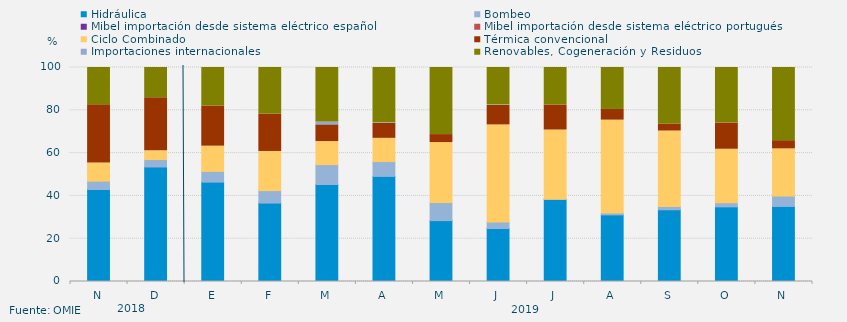
| Category | Hidráulica | Bombeo | Mibel importación desde sistema eléctrico español | Mibel importación desde sistema eléctrico portugués | Ciclo Combinado | Térmica convencional | Importaciones internacionales | Renovables, Cogeneración y Residuos |
|---|---|---|---|---|---|---|---|---|
| N | 42.998 | 3.9 | 0 | 0 | 8.472 | 27.187 | 0 | 17.442 |
| D | 53.517 | 3.472 | 0 | 0 | 4.077 | 24.798 | 0 | 14.135 |
| E | 46.427 | 5.029 | 0 | 0 | 11.794 | 18.75 | 0 | 18 |
| F | 36.657 | 5.804 | 0 | 0 | 18.304 | 17.386 | 0 | 21.85 |
| M | 45.334 | 9.275 | 0 | 0 | 10.778 | 7.806 | 1.38 | 25.426 |
| A | 49.12 | 6.921 | 0 | 0 | 10.856 | 7.014 | 0.255 | 25.833 |
| M | 28.45 | 8.423 | 0 | 0 | 28.047 | 3.741 | 0.067 | 31.272 |
| J | 24.757 | 3.102 | 0 | 0 | 45.313 | 9.086 | 0.278 | 17.465 |
| J | 38.418 | 0.067 | 0 | 0 | 32.303 | 11.671 | 0 | 17.54 |
| A | 31.127 | 0.829 | 0 | 0 | 43.448 | 4.984 | 0 | 19.612 |
| S | 33.519 | 1.528 | 0 | 0 | 35.278 | 3.171 | 0 | 26.505 |
| O | 34.879 | 1.949 | 0 | 0 | 24.978 | 12.231 | 0 | 25.963 |
| N | 35.069 | 4.931 | 0 | 0 | 21.991 | 3.819 | 0 | 34.19 |